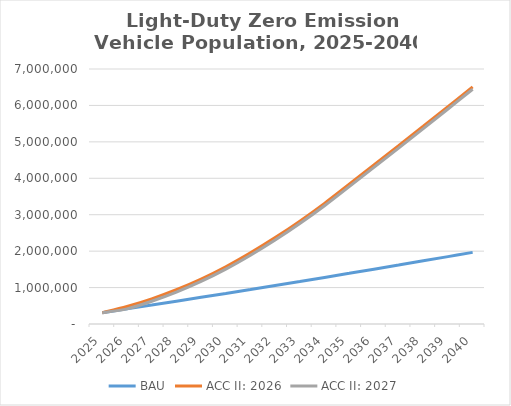
| Category | BAU | ACC II: 2026 | ACC II: 2027 |
|---|---|---|---|
| 2025.0 | 310585.272 | 310585.272 | 310585.272 |
| 2026.0 | 414864.747 | 480342.558 | 414864.747 |
| 2027.0 | 519869.834 | 690352.731 | 624874.921 |
| 2028.0 | 625590.353 | 941131.637 | 875653.827 |
| 2029.0 | 732016.127 | 1233183.76 | 1167705.949 |
| 2030.0 | 839136.976 | 1571984.585 | 1506506.774 |
| 2031.0 | 947370.17 | 1954576.34 | 1889098.53 |
| 2032.0 | 1056718.933 | 2371627.438 | 2306149.627 |
| 2033.0 | 1167186.491 | 2823773.72 | 2758295.91 |
| 2034.0 | 1278776.067 | 3311653.729 | 3246175.919 |
| 2035.0 | 1391490.888 | 3835908.707 | 3770430.896 |
| 2036.0 | 1504944.798 | 4363601.313 | 4298123.503 |
| 2037.0 | 1619137.799 | 4894731.549 | 4829253.739 |
| 2038.0 | 1734069.89 | 5429299.415 | 5363821.604 |
| 2039.0 | 1849741.071 | 5967304.909 | 5901827.099 |
| 2040.0 | 1966151.343 | 6508748.033 | 6443270.223 |